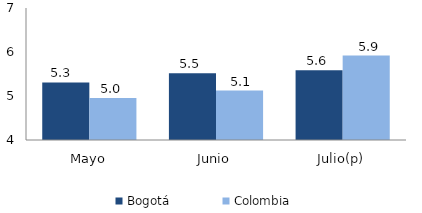
| Category | Bogotá | Colombia |
|---|---|---|
| Mayo | 5.308 | 4.954 |
| Junio | 5.519 | 5.125 |
| Julio(p) | 5.586 | 5.92 |